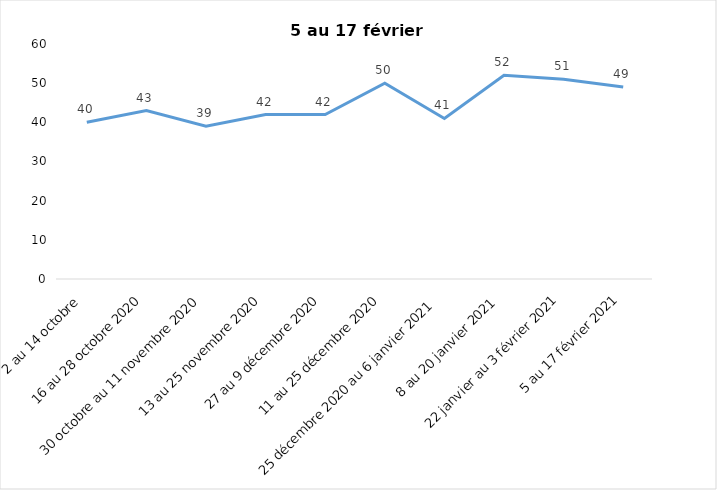
| Category | Toujours aux trois mesures |
|---|---|
| 2 au 14 octobre  | 40 |
| 16 au 28 octobre 2020 | 43 |
| 30 octobre au 11 novembre 2020 | 39 |
| 13 au 25 novembre 2020 | 42 |
| 27 au 9 décembre 2020 | 42 |
| 11 au 25 décembre 2020 | 50 |
| 25 décembre 2020 au 6 janvier 2021 | 41 |
| 8 au 20 janvier 2021 | 52 |
| 22 janvier au 3 février 2021 | 51 |
| 5 au 17 février 2021 | 49 |